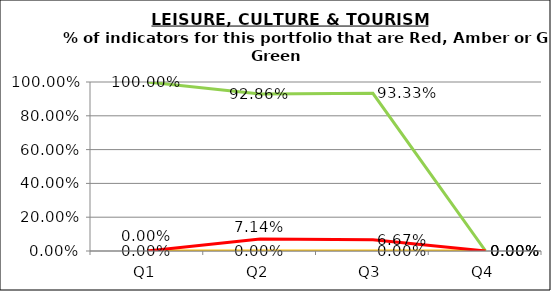
| Category | Green | Amber | Red |
|---|---|---|---|
| Q1 | 1 | 0 | 0 |
| Q2 | 0.929 | 0 | 0.071 |
| Q3 | 0.933 | 0 | 0.067 |
| Q4 | 0 | 0 | 0 |